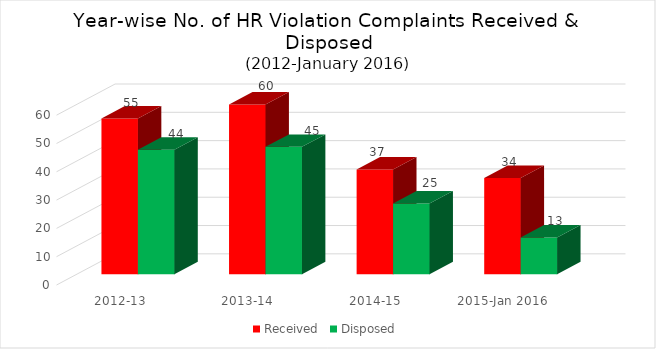
| Category | Received | Disposed |
|---|---|---|
| 2012-13 | 55 | 44 |
| 2013-14 | 60 | 45 |
| 2014-15 | 37 | 25 |
| 2015-Jan 2016 | 34 | 13 |